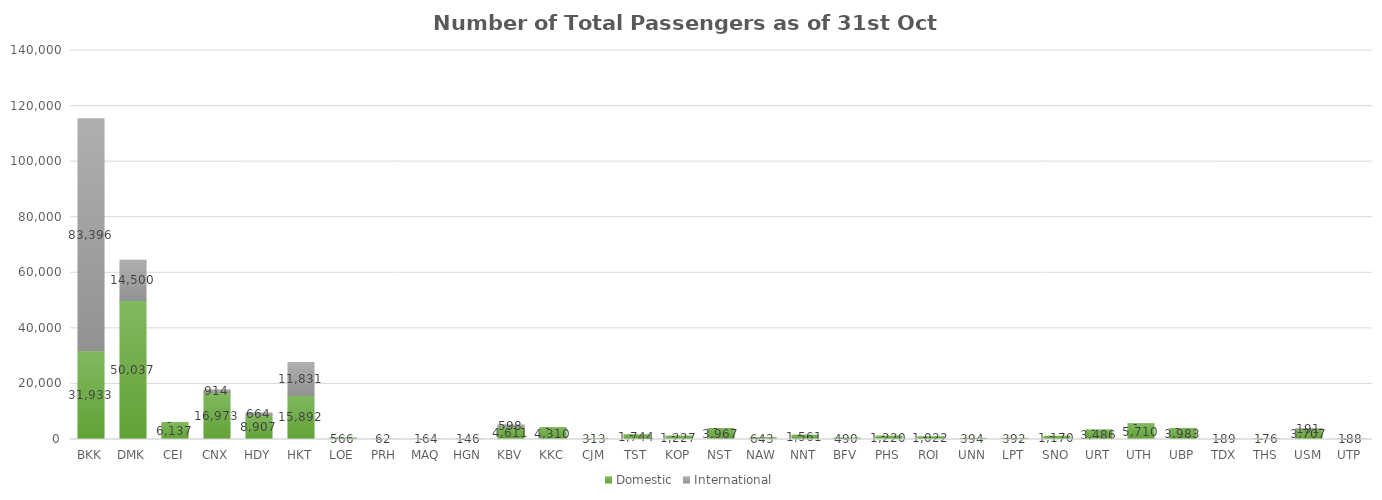
| Category | Domestic | International |
|---|---|---|
| BKK | 31933 | 83396 |
| DMK | 50037 | 14500 |
| CEI | 6137 | 0 |
| CNX | 16973 | 914 |
| HDY | 8907 | 664 |
| HKT | 15892 | 11831 |
| LOE | 566 | 0 |
| PRH | 62 | 0 |
| MAQ | 164 | 0 |
| HGN | 146 | 0 |
| KBV | 4611 | 598 |
| KKC | 4310 | 0 |
| CJM | 313 | 0 |
| TST | 1744 | 0 |
| KOP | 1227 | 0 |
| NST | 3967 | 0 |
| NAW | 643 | 0 |
| NNT | 1561 | 0 |
| BFV | 490 | 0 |
| PHS | 1220 | 0 |
| ROI | 1022 | 0 |
| UNN | 394 | 0 |
| LPT | 392 | 0 |
| SNO | 1170 | 0 |
| URT | 3486 | 0 |
| UTH | 5710 | 0 |
| UBP | 3983 | 0 |
| TDX | 189 | 0 |
| THS | 176 | 0 |
| USM | 3707 | 191 |
| UTP | 188 | 0 |